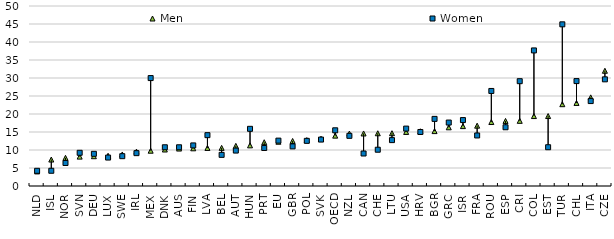
| Category | Men | Women |
|---|---|---|
| NLD | 4.053 | 4.219 |
| ISL | 7.351 | 4.23 |
| NOR | 7.826 | 6.393 |
| SVN | 8.16 | 9.227 |
| DEU | 8.274 | 8.937 |
| LUX | 8.4 | 7.9 |
| SWE | 8.761 | 8.284 |
| IRL | 9.549 | 9.123 |
| MEX | 9.804 | 29.978 |
| DNK | 10.138 | 10.758 |
| AUS | 10.403 | 10.756 |
| FIN | 10.471 | 11.275 |
| LVA | 10.575 | 14.125 |
| BEL | 10.591 | 8.646 |
| AUT | 11.154 | 9.84 |
| HUN | 11.291 | 15.884 |
| PRT | 12.158 | 10.564 |
| EU | 12.3 | 12.6 |
| GBR | 12.511 | 11.004 |
| POL | 12.752 | 12.541 |
| SVK | 13.146 | 12.895 |
| OECD | 13.989 | 15.472 |
| NZL | 14.558 | 13.934 |
| CAN | 14.593 | 9.026 |
| CHE | 14.651 | 10.077 |
| LTU | 14.665 | 12.746 |
| USA | 15.013 | 15.944 |
| HRV | 15.2 | 15 |
| BGR | 15.251 | 18.642 |
| GRC | 16.306 | 17.624 |
| ISR | 16.634 | 18.315 |
| FRA | 16.758 | 14.04 |
| ROU | 17.77 | 26.4 |
| ESP | 18.075 | 16.316 |
| CRI | 18.102 | 29.117 |
| COL | 19.423 | 37.66 |
| EST | 19.432 | 10.772 |
| TUR | 22.724 | 44.905 |
| CHL | 23.076 | 29.142 |
| ITA | 24.62 | 23.592 |
| CZE | 32.011 | 29.628 |